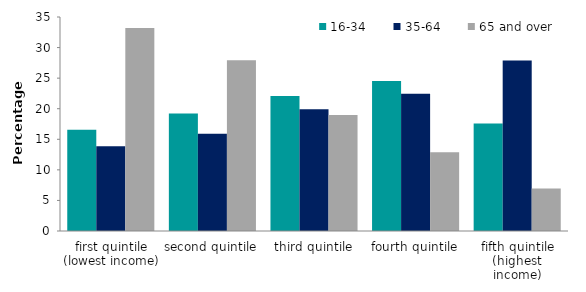
| Category | 16-34 | 35-64 | 65 and over |
|---|---|---|---|
| first quintile (lowest income) | 16.577 | 13.854 | 33.208 |
| second quintile | 19.207 | 15.914 | 27.945 |
| third quintile | 22.077 | 19.9 | 18.989 |
| fourth quintile | 24.545 | 22.447 | 12.889 |
| fifth quintile (highest income) | 17.594 | 27.884 | 6.97 |